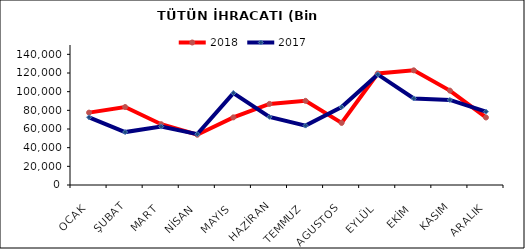
| Category | 2018 | 2017 |
|---|---|---|
| OCAK | 77553.727 | 72553.879 |
| ŞUBAT | 83548.081 | 56698.544 |
| MART | 65103.24 | 62550.802 |
| NİSAN | 53878.587 | 54475.133 |
| MAYIS | 72477.136 | 98506.515 |
| HAZİRAN | 86879.484 | 72979.067 |
| TEMMUZ | 90149.988 | 63649.259 |
| AGUSTOS | 66542.85 | 83484.789 |
| EYLÜL | 119426.97 | 118488.165 |
| EKİM | 122858.87 | 92727.963 |
| KASIM | 101133.177 | 91153.987 |
| ARALIK | 72344.965 | 78543.74 |